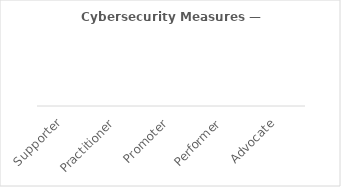
| Category | Series 0 |
|---|---|
| Supporter | 0 |
| Practitioner | 0 |
| Promoter | 0 |
| Performer | 0 |
| Advocate | 0 |